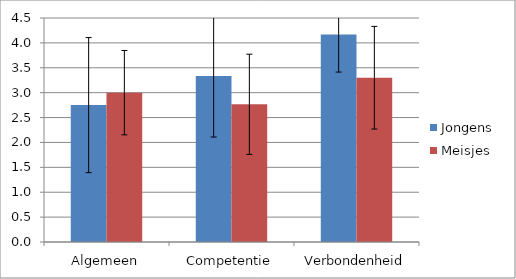
| Category | Jongens | Meisjes |
|---|---|---|
| Algemeen | 2.75 | 3 |
| Competentie | 3.333 | 2.767 |
| Verbondenheid | 4.167 | 3.3 |